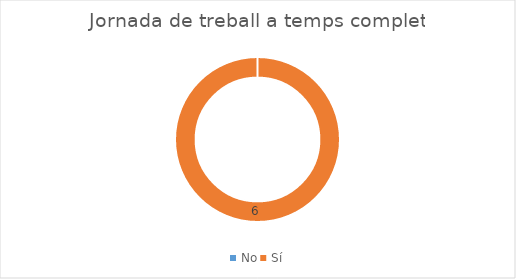
| Category | Series 0 |
|---|---|
| No | 0 |
| Sí | 6 |